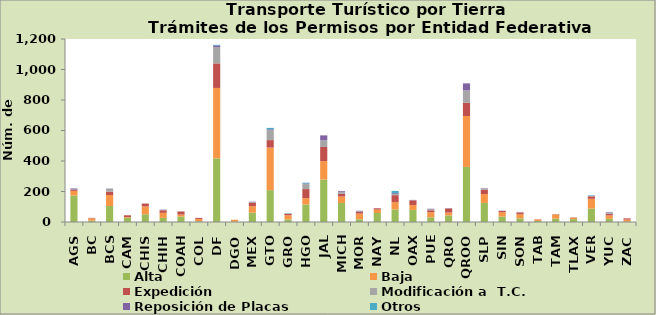
| Category | Alta                                         | Baja | Expedición | Modificación a  T.C. | Reposición de Placas | Otros |
|---|---|---|---|---|---|---|
| AGS | 174 | 30 | 7 | 2 | 7 | 0 |
| BC | 9 | 15 | 3 | 0 | 0 | 0 |
| BCS | 105 | 72 | 22 | 20 | 1 | 0 |
| CAM | 28 | 4 | 12 | 0 | 0 | 0 |
| CHIS | 51 | 51 | 19 | 0 | 0 | 0 |
| CHIH | 27 | 33 | 17 | 2 | 2 | 0 |
| COAH | 36 | 13 | 20 | 1 | 0 | 0 |
| COL | 5 | 15 | 6 | 0 | 1 | 0 |
| DF | 417 | 462 | 161 | 107 | 11 | 4 |
| DGO | 3 | 12 | 0 | 0 | 0 | 0 |
| MEX | 61 | 43 | 21 | 5 | 3 | 0 |
| GTO | 209 | 279 | 49 | 65 | 6 | 9 |
| GRO | 17 | 27 | 11 | 1 | 0 | 2 |
| HGO | 115 | 41 | 60 | 33 | 4 | 5 |
| JAL | 278 | 121 | 93 | 44 | 32 | 0 |
| MICH | 125 | 42 | 17 | 11 | 7 | 0 |
| MOR | 18 | 37 | 13 | 2 | 3 | 1 |
| NAY | 59 | 22 | 9 | 0 | 0 | 0 |
| NL | 82 | 48 | 46 | 7 | 6 | 15 |
| OAX | 79 | 32 | 31 | 1 | 2 | 0 |
| PUE | 31 | 33 | 13 | 7 | 3 | 0 |
| QRO | 43 | 19 | 27 | 2 | 1 | 0 |
| QROO | 361 | 334 | 87 | 81 | 46 | 0 |
| SLP | 125 | 58 | 29 | 7 | 3 | 0 |
| SIN | 36 | 28 | 8 | 3 | 0 | 0 |
| SON | 24 | 27 | 11 | 3 | 1 | 0 |
| TAB | 7 | 9 | 2 | 0 | 0 | 0 |
| TAM | 22 | 28 | 1 | 0 | 1 | 0 |
| TLAX | 19 | 10 | 1 | 1 | 0 | 0 |
| VER | 88 | 64 | 16 | 2 | 2 | 3 |
| YUC | 21 | 22 | 11 | 8 | 3 | 1 |
| ZAC | 3 | 13 | 8 | 0 | 0 | 0 |